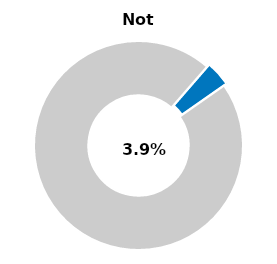
| Category | Series 0 |
|---|---|
| Not passed | 0.039 |
| Other | 0.961 |